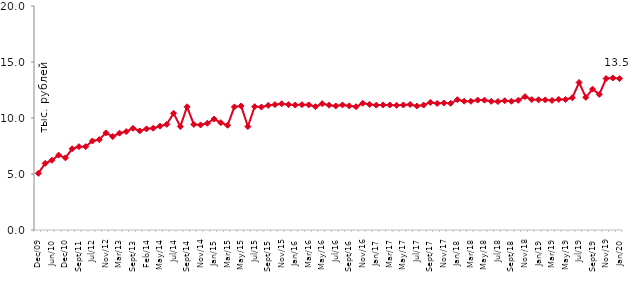
| Category | медианное значение среднедушевого располагаемого дохода, тыс. руб. |
|---|---|
| 2009-12-01 | 5.058 |
| 2010-04-01 | 5.949 |
| 2010-06-01 | 6.224 |
| 2010-09-01 | 6.686 |
| 2010-12-01 | 6.44 |
| 2011-07-01 | 7.25 |
| 2011-09-01 | 7.441 |
| 2011-12-01 | 7.446 |
| 2012-07-01 | 7.95 |
| 2012-09-01 | 8.071 |
| 2012-11-01 | 8.673 |
| 2012-12-01 | 8.345 |
| 2013-03-01 | 8.644 |
| 2013-06-01 | 8.789 |
| 2013-09-01 | 9.079 |
| 2013-12-01 | 8.849 |
| 2014-02-01 | 9.025 |
| 2014-04-01 | 9.087 |
| 2014-05-01 | 9.273 |
| 2014-06-01 | 9.432 |
| 2014-07-01 | 10.422 |
| 2014-08-01 | 9.241 |
| 2014-09-01 | 11 |
| 2014-10-01 | 9.426 |
| 2014-11-01 | 9.381 |
| 2014-12-01 | 9.532 |
| 2015-01-01 | 9.908 |
| 2015-02-01 | 9.585 |
| 2015-03-01 | 9.35 |
| 2015-04-01 | 10.991 |
| 2015-05-01 | 11.076 |
| 2015-06-01 | 9.237 |
| 2015-07-01 | 11.013 |
| 2015-08-01 | 10.981 |
| 2015-09-01 | 11.124 |
| 2015-10-01 | 11.195 |
| 2015-11-01 | 11.268 |
| 2015-12-01 | 11.194 |
| 2016-01-01 | 11.158 |
| 2016-02-01 | 11.188 |
| 2016-03-01 | 11.174 |
| 2016-04-01 | 11.01 |
| 2016-05-01 | 11.278 |
| 2016-06-01 | 11.142 |
| 2016-07-01 | 11.072 |
| 2016-08-01 | 11.165 |
| 2016-09-01 | 11.082 |
| 2016-10-01 | 11.008 |
| 2016-11-01 | 11.313 |
| 2016-12-01 | 11.216 |
| 2017-01-01 | 11.146 |
| 2017-02-01 | 11.17 |
| 2017-03-01 | 11.162 |
| 2017-04-01 | 11.133 |
| 2017-05-01 | 11.163 |
| 2017-06-01 | 11.207 |
| 2017-07-01 | 11.066 |
| 2017-08-01 | 11.153 |
| 2017-09-01 | 11.395 |
| 2017-10-01 | 11.301 |
| 2017-11-01 | 11.342 |
| 2017-12-01 | 11.31 |
| 2018-01-01 | 11.637 |
| 2018-02-01 | 11.497 |
| 2018-03-01 | 11.49 |
| 2018-04-01 | 11.601 |
| 2018-05-01 | 11.592 |
| 2018-06-01 | 11.491 |
| 2018-07-01 | 11.471 |
| 2018-08-01 | 11.541 |
| 2018-09-01 | 11.497 |
| 2018-10-01 | 11.578 |
| 2018-11-01 | 11.906 |
| 2018-12-01 | 11.648 |
| 2019-01-01 | 11.629 |
| 2019-02-01 | 11.617 |
| 2019-03-01 | 11.566 |
| 2019-04-01 | 11.659 |
| 2019-05-01 | 11.653 |
| 2019-06-01 | 11.805 |
| 2019-07-01 | 13.174 |
| 2019-08-01 | 11.844 |
| 2019-09-01 | 12.577 |
| 2019-10-01 | 12.107 |
| 2019-11-01 | 13.523 |
| 2019-12-01 | 13.573 |
| 2020-01-01 | 13.516 |